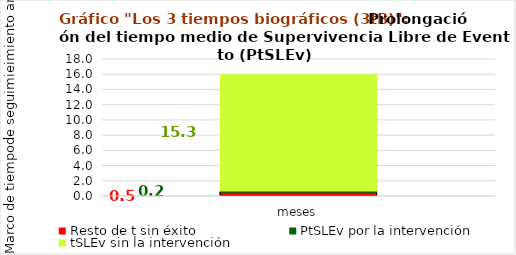
| Category | Resto de t sin éxito | PtSLEv por la intervención | tSLEv sin la intervención |
|---|---|---|---|
| meses | 0.544 | 0.174 | 15.282 |